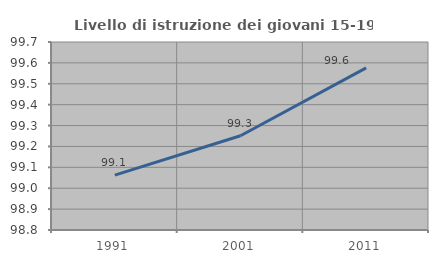
| Category | Livello di istruzione dei giovani 15-19 anni |
|---|---|
| 1991.0 | 99.062 |
| 2001.0 | 99.251 |
| 2011.0 | 99.576 |